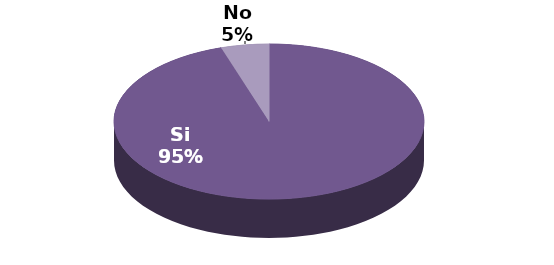
| Category | Series 1 |
|---|---|
| Si | 19 |
| No | 1 |